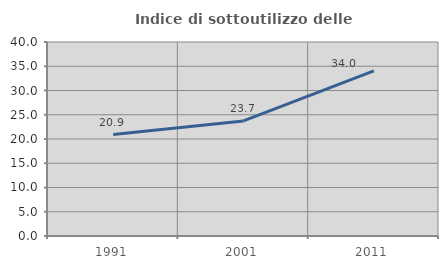
| Category | Indice di sottoutilizzo delle abitazioni  |
|---|---|
| 1991.0 | 20.91 |
| 2001.0 | 23.73 |
| 2011.0 | 34.027 |